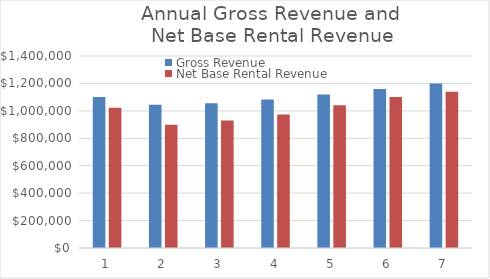
| Category | Gross Revenue | Net Base Rental Revenue |
|---|---|---|
| 0 | 1100305 | 1023283.65 |
| 1 | 1045289.75 | 898949.185 |
| 2 | 1055742.648 | 929053.53 |
| 3 | 1082136.214 | 973922.592 |
| 4 | 1120010.981 | 1041610.212 |
| 5 | 1159211.366 | 1101250.797 |
| 6 | 1199783.763 | 1139794.575 |